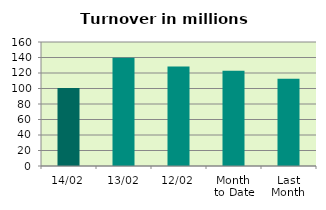
| Category | Series 0 |
|---|---|
| 14/02 | 100.651 |
| 13/02 | 139.608 |
| 12/02 | 128.233 |
| Month 
to Date | 122.926 |
| Last
Month | 112.571 |